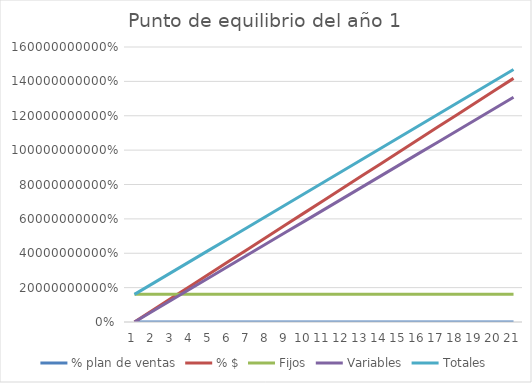
| Category | % plan de ventas | % $ | Fijos | Variables | Totales |
|---|---|---|---|---|---|
| 0 | 0 | 0 | 160743884.062 | 0 | 160743884.062 |
| 1 | 0.05 | 70875000 | 160743884.062 | 65393254.222 | 226137138.284 |
| 2 | 0.1 | 141750000 | 160743884.062 | 130786508.444 | 291530392.506 |
| 3 | 0.15 | 212625000 | 160743884.062 | 196179762.666 | 356923646.729 |
| 4 | 0.2 | 283500000 | 160743884.062 | 261573016.889 | 422316900.951 |
| 5 | 0.25 | 354375000 | 160743884.062 | 326966271.111 | 487710155.173 |
| 6 | 0.3 | 425250000 | 160743884.062 | 392359525.333 | 553103409.395 |
| 7 | 0.35 | 496125000 | 160743884.062 | 457752779.555 | 618496663.617 |
| 8 | 0.4 | 567000000 | 160743884.062 | 523146033.777 | 683889917.839 |
| 9 | 0.45 | 637875000 | 160743884.062 | 588539287.999 | 749283172.061 |
| 10 | 0.5 | 708750000 | 160743884.062 | 653932542.221 | 814676426.284 |
| 11 | 0.55 | 779625000 | 160743884.062 | 719325796.444 | 880069680.506 |
| 12 | 0.6 | 850500000 | 160743884.062 | 784719050.666 | 945462934.728 |
| 13 | 0.65 | 921375000 | 160743884.062 | 850112304.888 | 1010856188.95 |
| 14 | 0.7 | 992250000 | 160743884.062 | 915505559.11 | 1076249443.172 |
| 15 | 0.75 | 1063125000 | 160743884.062 | 980898813.332 | 1141642697.394 |
| 16 | 0.8 | 1134000000 | 160743884.062 | 1046292067.554 | 1207035951.616 |
| 17 | 0.85 | 1204875000 | 160743884.062 | 1111685321.776 | 1272429205.839 |
| 18 | 0.9 | 1275750000 | 160743884.062 | 1177078575.999 | 1337822460.061 |
| 19 | 0.95 | 1346625000 | 160743884.062 | 1242471830.221 | 1403215714.283 |
| 20 | 1 | 1417500000 | 160743884.062 | 1307865084.443 | 1468608968.505 |